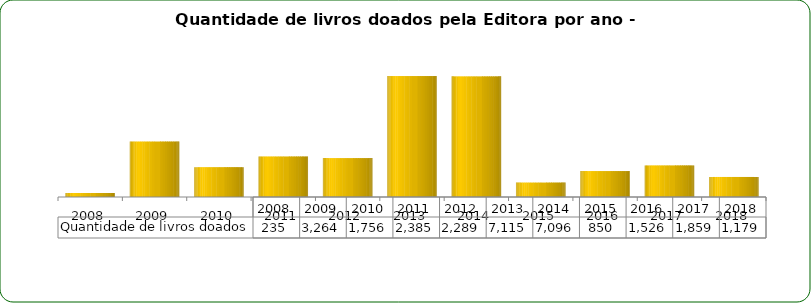
| Category | Quantidade de livros doados |
|---|---|
| 2008.0 | 235 |
| 2009.0 | 3264 |
| 2010.0 | 1756 |
| 2011.0 | 2385 |
| 2012.0 | 2289 |
| 2013.0 | 7115 |
| 2014.0 | 7096 |
| 2015.0 | 850 |
| 2016.0 | 1526 |
| 2017.0 | 1859 |
| 2018.0 | 1179 |